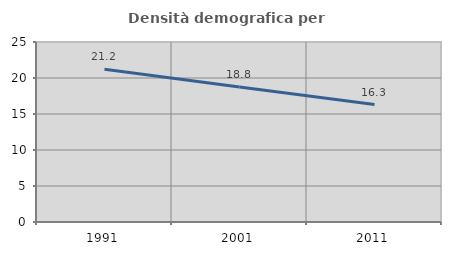
| Category | Densità demografica |
|---|---|
| 1991.0 | 21.218 |
| 2001.0 | 18.761 |
| 2011.0 | 16.304 |